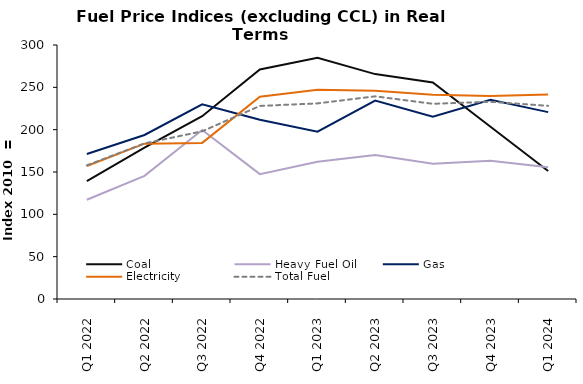
| Category | Coal | Heavy Fuel Oil | Gas | Electricity | Total Fuel |
|---|---|---|---|---|---|
| Q1 2022 | 139.146 | 117.168 | 171.189 | 157.139 | 157.851 |
| Q2 2022 | 178.664 | 145.467 | 193.693 | 183.47 | 183.788 |
| Q3 2022 | 215.915 | 199.709 | 229.852 | 184.391 | 198.045 |
| Q4 2022 | 271.138 | 147.498 | 211.773 | 238.955 | 228.023 |
| Q1 2023 | 284.99 | 161.998 | 197.667 | 247.115 | 231.035 |
| Q2 2023 | 265.616 | 170.209 | 234.353 | 245.849 | 239.376 |
| Q3 2023 | 255.797 | 159.837 | 215.285 | 241.241 | 230.55 |
| Q4 2023 | 203.472 | 163.252 | 235.208 | 239.674 | 232.938 |
| Q1 2024 | 151.169 | 155.577 | 220.701 | 241.573 | 228.135 |